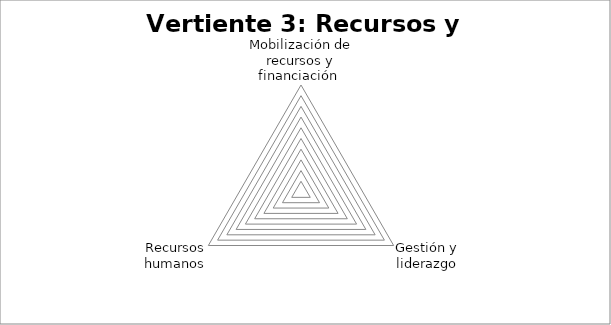
| Category | Series 0 |
|---|---|
| Mobilización de recursos y financiación  | 0 |
| Gestión y liderazgo | 0 |
| Recursos humanos | 0 |